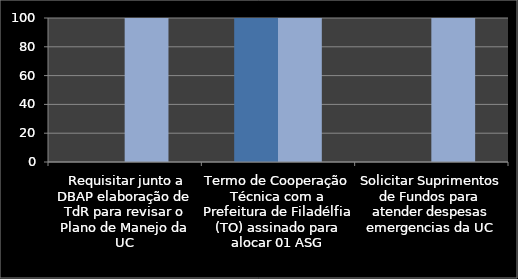
| Category | Inicio % | % |
|---|---|---|
|  Requisitar junto a DBAP elaboração de TdR para revisar o Plano de Manejo da UC | 0 | 100 |
| Termo de Cooperação Técnica com a Prefeitura de Filadélfia (TO) assinado para alocar 01 ASG | 100 | 100 |
| Solicitar Suprimentos de Fundos para atender despesas emergencias da UC | 0 | 100 |